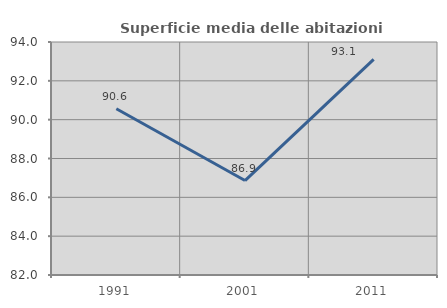
| Category | Superficie media delle abitazioni occupate |
|---|---|
| 1991.0 | 90.561 |
| 2001.0 | 86.864 |
| 2011.0 | 93.104 |